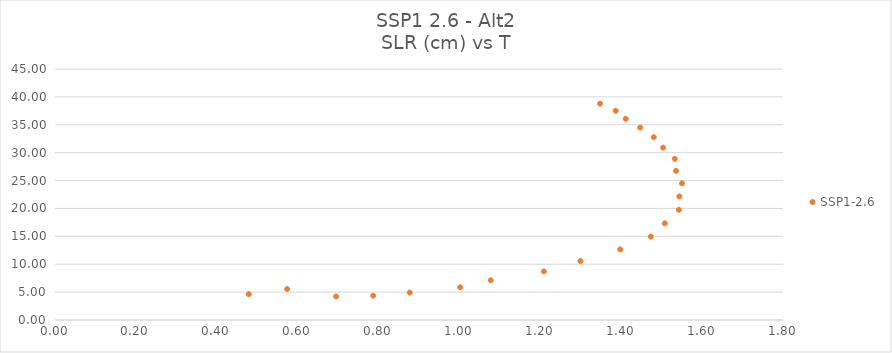
| Category | SSP1-2.6 |
|---|---|
| 0.573801925 | 5.549 |
| 0.479031654 | 4.625 |
| 0.695197934 | 4.219 |
| 0.786748548 | 4.353 |
| 0.877021499 | 4.915 |
| 1.001823785 | 5.869 |
| 1.077169017 | 7.122 |
| 1.208724293 | 8.712 |
| 1.299089785 | 10.562 |
| 1.397428844 | 12.664 |
| 1.473063074 | 14.955 |
| 1.507763893 | 17.328 |
| 1.542667368 | 19.756 |
| 1.54351856 | 22.145 |
| 1.550291126 | 24.492 |
| 1.535456385 | 26.734 |
| 1.532382879 | 28.893 |
| 1.50342724 | 30.904 |
| 1.480412326 | 32.781 |
| 1.446935391 | 34.502 |
| 1.411167252 | 36.066 |
| 1.386227825 | 37.503 |
| 1.347639205 | 38.788 |